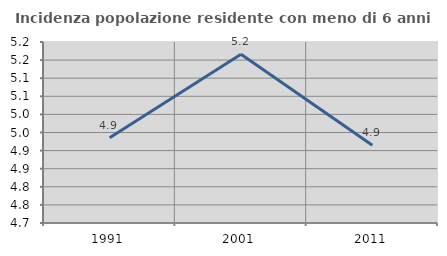
| Category | Incidenza popolazione residente con meno di 6 anni |
|---|---|
| 1991.0 | 4.935 |
| 2001.0 | 5.166 |
| 2011.0 | 4.915 |